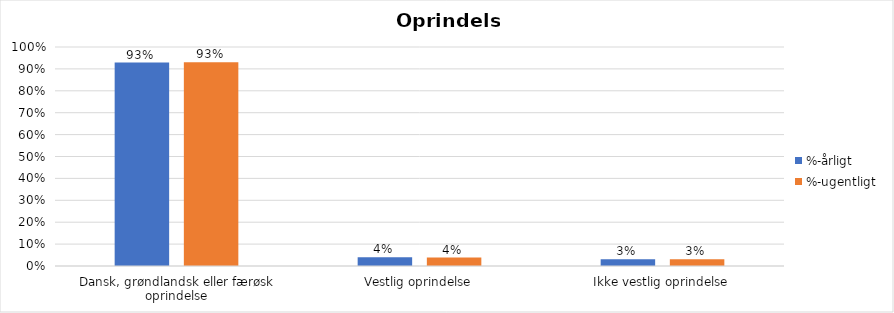
| Category | %-årligt | %-ugentligt |
|---|---|---|
| Dansk, grøndlandsk eller færøsk oprindelse | 0.929 | 0.931 |
| Vestlig oprindelse | 0.04 | 0.038 |
| Ikke vestlig oprindelse | 0.031 | 0.031 |